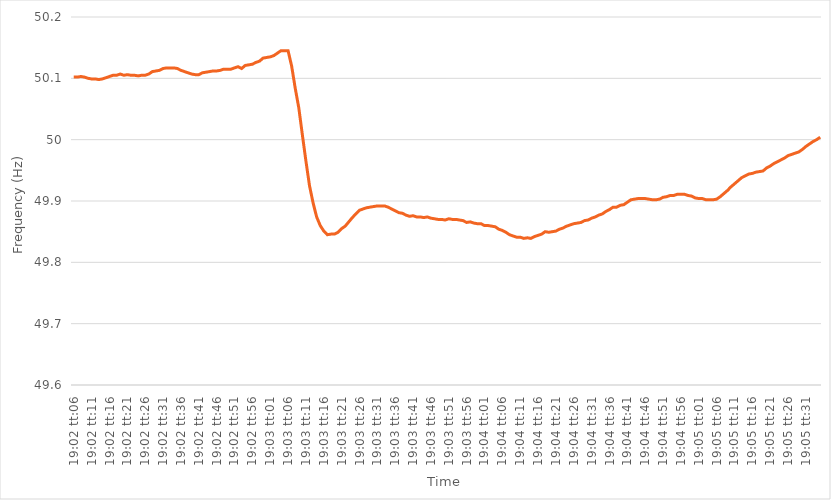
| Category | Series 0 |
|---|---|
| 0.793125 | 50.102 |
| 0.7931365740740741 | 50.102 |
| 0.793148148148148 | 50.103 |
| 0.7931597222222222 | 50.102 |
| 0.7931712962962963 | 50.1 |
| 0.7931828703703704 | 50.099 |
| 0.7931944444444444 | 50.099 |
| 0.7932060185185185 | 50.098 |
| 0.7932175925925926 | 50.099 |
| 0.7932291666666668 | 50.101 |
| 0.7932407407407407 | 50.103 |
| 0.7932523148148148 | 50.105 |
| 0.7932638888888889 | 50.105 |
| 0.793275462962963 | 50.107 |
| 0.793287037037037 | 50.105 |
| 0.7932986111111111 | 50.106 |
| 0.7933101851851853 | 50.105 |
| 0.7933217592592593 | 50.105 |
| 0.7933333333333333 | 50.104 |
| 0.7933449074074074 | 50.105 |
| 0.7933564814814815 | 50.105 |
| 0.7933680555555555 | 50.107 |
| 0.7933796296296296 | 50.111 |
| 0.7933912037037038 | 50.112 |
| 0.7934027777777778 | 50.113 |
| 0.7934143518518518 | 50.116 |
| 0.7934259259259259 | 50.117 |
| 0.7934375 | 50.117 |
| 0.7934490740740742 | 50.117 |
| 0.7934606481481481 | 50.116 |
| 0.7934722222222222 | 50.113 |
| 0.7934837962962963 | 50.111 |
| 0.7934953703703704 | 50.109 |
| 0.7935069444444444 | 50.107 |
| 0.7935185185185185 | 50.106 |
| 0.7935300925925927 | 50.106 |
| 0.7935416666666667 | 50.109 |
| 0.7935532407407407 | 50.11 |
| 0.7935648148148148 | 50.111 |
| 0.7935763888888889 | 50.112 |
| 0.7935879629629629 | 50.112 |
| 0.793599537037037 | 50.113 |
| 0.7936111111111112 | 50.115 |
| 0.7936226851851852 | 50.115 |
| 0.7936342592592592 | 50.115 |
| 0.7936458333333333 | 50.117 |
| 0.7936574074074074 | 50.119 |
| 0.7936689814814816 | 50.116 |
| 0.7936805555555555 | 50.121 |
| 0.7936921296296297 | 50.122 |
| 0.7937037037037037 | 50.123 |
| 0.7937152777777778 | 50.126 |
| 0.7937268518518518 | 50.128 |
| 0.7937384259259259 | 50.133 |
| 0.7937500000000001 | 50.134 |
| 0.7937615740740741 | 50.135 |
| 0.7937731481481481 | 50.137 |
| 0.7937847222222222 | 50.141 |
| 0.7937962962962963 | 50.145 |
| 0.7938078703703703 | 50.145 |
| 0.7938194444444444 | 50.145 |
| 0.7938310185185186 | 50.12 |
| 0.7938425925925926 | 50.084 |
| 0.7938541666666666 | 50.052 |
| 0.7938657407407407 | 50.008 |
| 0.7938773148148148 | 49.965 |
| 0.793888888888889 | 49.925 |
| 0.7939004629629629 | 49.897 |
| 0.793912037037037 | 49.874 |
| 0.7939236111111111 | 49.86 |
| 0.7939351851851852 | 49.851 |
| 0.7939467592592592 | 49.845 |
| 0.7939583333333333 | 49.846 |
| 0.7939699074074075 | 49.846 |
| 0.7939814814814815 | 49.849 |
| 0.7939930555555555 | 49.855 |
| 0.7940046296296296 | 49.859 |
| 0.7940162037037037 | 49.866 |
| 0.7940277777777779 | 49.873 |
| 0.7940393518518518 | 49.879 |
| 0.794050925925926 | 49.885 |
| 0.7940625 | 49.887 |
| 0.794074074074074 | 49.889 |
| 0.7940856481481481 | 49.89 |
| 0.7940972222222222 | 49.891 |
| 0.7941087962962964 | 49.892 |
| 0.7941203703703703 | 49.892 |
| 0.7941319444444445 | 49.892 |
| 0.7941435185185185 | 49.89 |
| 0.7941550925925926 | 49.887 |
| 0.7941666666666666 | 49.884 |
| 0.7941782407407407 | 49.881 |
| 0.7941898148148149 | 49.88 |
| 0.7942013888888889 | 49.877 |
| 0.794212962962963 | 49.875 |
| 0.794224537037037 | 49.876 |
| 0.7942361111111111 | 49.874 |
| 0.7942476851851853 | 49.874 |
| 0.7942592592592592 | 49.873 |
| 0.7942708333333334 | 49.874 |
| 0.7942824074074074 | 49.872 |
| 0.7942939814814814 | 49.871 |
| 0.7943055555555555 | 49.87 |
| 0.7943171296296296 | 49.87 |
| 0.7943287037037038 | 49.869 |
| 0.7943402777777777 | 49.871 |
| 0.7943518518518519 | 49.87 |
| 0.7943634259259259 | 49.87 |
| 0.794375 | 49.869 |
| 0.794386574074074 | 49.868 |
| 0.7943981481481481 | 49.865 |
| 0.7944097222222223 | 49.866 |
| 0.7944212962962963 | 49.864 |
| 0.7944328703703704 | 49.863 |
| 0.7944444444444444 | 49.863 |
| 0.7944560185185185 | 49.86 |
| 0.7944675925925927 | 49.86 |
| 0.7944791666666666 | 49.859 |
| 0.7944907407407408 | 49.858 |
| 0.7945023148148148 | 49.854 |
| 0.7945138888888889 | 49.852 |
| 0.7945254629629629 | 49.849 |
| 0.794537037037037 | 49.845 |
| 0.7945486111111112 | 49.843 |
| 0.7945601851851851 | 49.841 |
| 0.7945717592592593 | 49.841 |
| 0.7945833333333333 | 49.839 |
| 0.7945949074074075 | 49.84 |
| 0.7946064814814814 | 49.839 |
| 0.7946180555555555 | 49.842 |
| 0.7946296296296297 | 49.844 |
| 0.7946412037037037 | 49.846 |
| 0.7946527777777778 | 49.85 |
| 0.7946643518518518 | 49.849 |
| 0.794675925925926 | 49.85 |
| 0.7946875000000001 | 49.851 |
| 0.794699074074074 | 49.854 |
| 0.7947106481481482 | 49.856 |
| 0.7947222222222222 | 49.859 |
| 0.7947337962962964 | 49.861 |
| 0.7947453703703703 | 49.863 |
| 0.7947569444444444 | 49.864 |
| 0.7947685185185186 | 49.865 |
| 0.7947800925925925 | 49.868 |
| 0.7947916666666667 | 49.869 |
| 0.7948032407407407 | 49.872 |
| 0.7948148148148149 | 49.874 |
| 0.7948263888888888 | 49.877 |
| 0.7948379629629629 | 49.879 |
| 0.7948495370370371 | 49.883 |
| 0.7948611111111111 | 49.886 |
| 0.7948726851851852 | 49.89 |
| 0.7948842592592592 | 49.89 |
| 0.7948958333333334 | 49.893 |
| 0.7949074074074075 | 49.894 |
| 0.7949189814814814 | 49.898 |
| 0.7949305555555556 | 49.902 |
| 0.7949421296296296 | 49.903 |
| 0.7949537037037038 | 49.904 |
| 0.7949652777777777 | 49.904 |
| 0.7949768518518519 | 49.904 |
| 0.794988425925926 | 49.903 |
| 0.7949999999999999 | 49.902 |
| 0.7950115740740741 | 49.902 |
| 0.7950231481481481 | 49.903 |
| 0.7950347222222223 | 49.906 |
| 0.7950462962962962 | 49.907 |
| 0.7950578703703703 | 49.909 |
| 0.7950694444444445 | 49.909 |
| 0.7950810185185185 | 49.911 |
| 0.7950925925925926 | 49.911 |
| 0.7951041666666666 | 49.911 |
| 0.7951157407407408 | 49.909 |
| 0.7951273148148149 | 49.908 |
| 0.7951388888888888 | 49.905 |
| 0.795150462962963 | 49.904 |
| 0.795162037037037 | 49.904 |
| 0.7951736111111112 | 49.902 |
| 0.7951851851851851 | 49.902 |
| 0.7951967592592593 | 49.902 |
| 0.7952083333333334 | 49.903 |
| 0.7952199074074073 | 49.907 |
| 0.7952314814814815 | 49.912 |
| 0.7952430555555555 | 49.917 |
| 0.7952546296296297 | 49.923 |
| 0.7952662037037036 | 49.928 |
| 0.7952777777777778 | 49.933 |
| 0.7952893518518519 | 49.938 |
| 0.7953009259259259 | 49.941 |
| 0.7953125 | 49.944 |
| 0.795324074074074 | 49.945 |
| 0.7953356481481482 | 49.947 |
| 0.7953472222222223 | 49.948 |
| 0.7953587962962962 | 49.949 |
| 0.7953703703703704 | 49.954 |
| 0.7953819444444444 | 49.957 |
| 0.7953935185185186 | 49.961 |
| 0.7954050925925925 | 49.964 |
| 0.7954166666666667 | 49.967 |
| 0.7954282407407408 | 49.97 |
| 0.7954398148148148 | 49.974 |
| 0.7954513888888889 | 49.976 |
| 0.7954629629629629 | 49.978 |
| 0.7954745370370371 | 49.98 |
| 0.795486111111111 | 49.984 |
| 0.7954976851851852 | 49.989 |
| 0.7955092592592593 | 49.993 |
| 0.7955208333333333 | 49.997 |
| 0.7955324074074074 | 50 |
| 0.7955439814814814 | 50.004 |